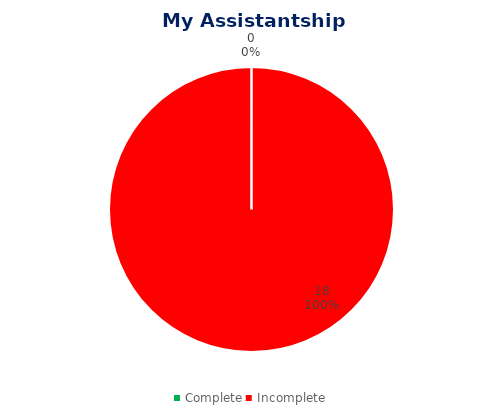
| Category | No. |
|---|---|
| Complete | 0 |
| Incomplete | 18 |